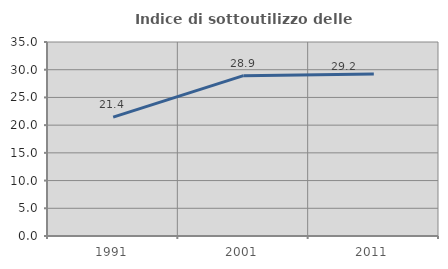
| Category | Indice di sottoutilizzo delle abitazioni  |
|---|---|
| 1991.0 | 21.438 |
| 2001.0 | 28.922 |
| 2011.0 | 29.235 |